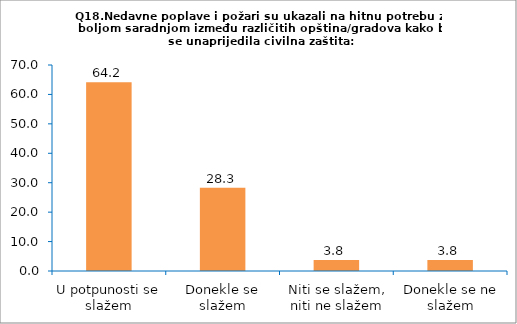
| Category | Series 0 |
|---|---|
| U potpunosti se slažem | 64.151 |
| Donekle se slažem | 28.302 |
| Niti se slažem, niti ne slažem | 3.774 |
| Donekle se ne slažem | 3.774 |